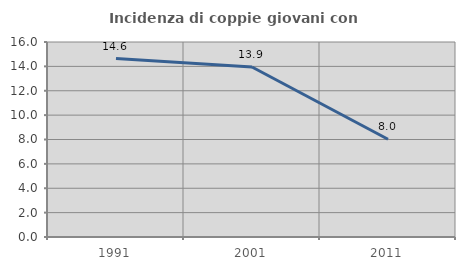
| Category | Incidenza di coppie giovani con figli |
|---|---|
| 1991.0 | 14.646 |
| 2001.0 | 13.945 |
| 2011.0 | 8.023 |